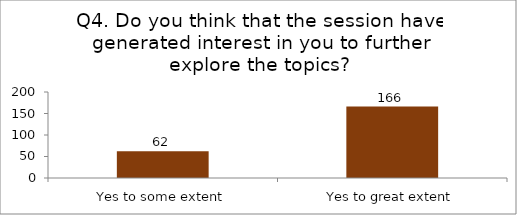
| Category | Q4. Do you think that the session have generated interest in you to further explore the topics? |
|---|---|
| Yes to some extent | 62 |
| Yes to great extent | 166 |